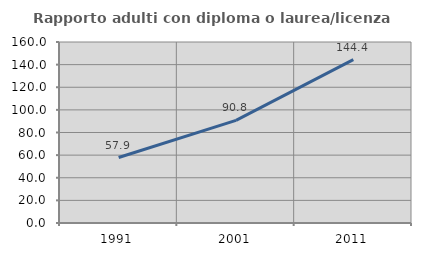
| Category | Rapporto adulti con diploma o laurea/licenza media  |
|---|---|
| 1991.0 | 57.895 |
| 2001.0 | 90.756 |
| 2011.0 | 144.444 |